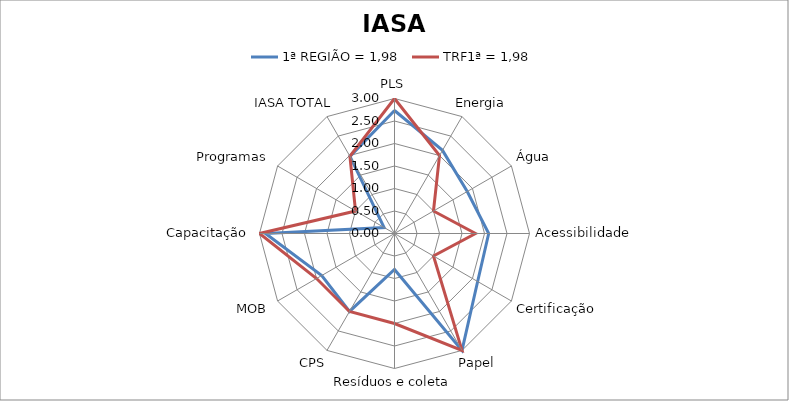
| Category | 1ª REGIÃO = 1,98 | TRF1ª = 1,98 |
|---|---|---|
| PLS | 2.733 | 3 |
| Energia | 2.133 | 2 |
| Água | 1.867 | 1 |
| Acessibilidade | 2.093 | 1.8 |
| Certificação | 2.133 | 1 |
| Papel | 3 | 3 |
| Resíduos e coleta | 0.8 | 2 |
| CPS | 2 | 2 |
| MOB | 1.867 | 2 |
| Capacitação | 2.867 | 3 |
| Programas | 0.267 | 1 |
| IASA TOTAL | 1.978 | 1.982 |